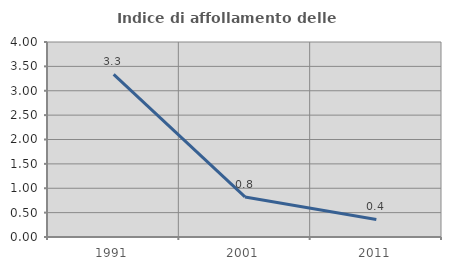
| Category | Indice di affollamento delle abitazioni  |
|---|---|
| 1991.0 | 3.337 |
| 2001.0 | 0.823 |
| 2011.0 | 0.36 |